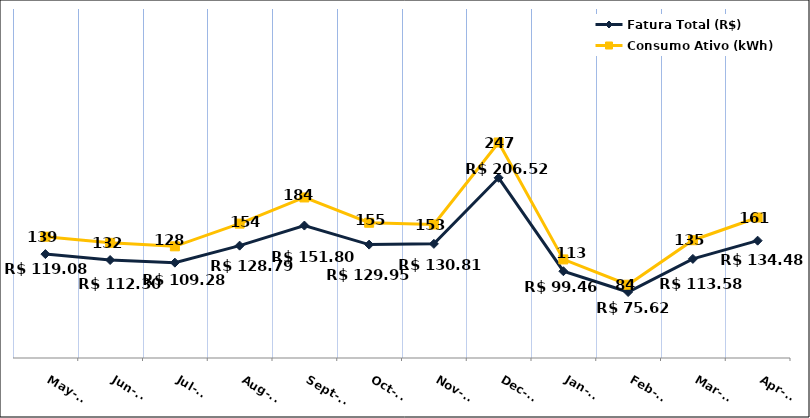
| Category | Fatura Total (R$) |
|---|---|
| 2023-05-01 | 119.08 |
| 2023-06-01 | 112.3 |
| 2023-07-01 | 109.28 |
| 2023-08-01 | 128.79 |
| 2023-09-01 | 151.8 |
| 2023-10-01 | 129.95 |
| 2023-11-01 | 130.81 |
| 2023-12-01 | 206.52 |
| 2024-01-01 | 99.46 |
| 2024-02-01 | 75.62 |
| 2024-03-01 | 113.58 |
| 2024-04-01 | 134.48 |